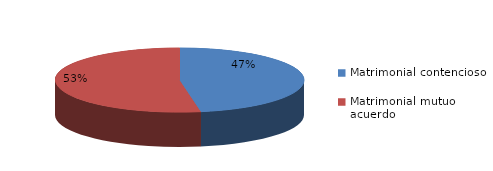
| Category | Series 0 |
|---|---|
| 0 | 977 |
| 1 | 1090 |